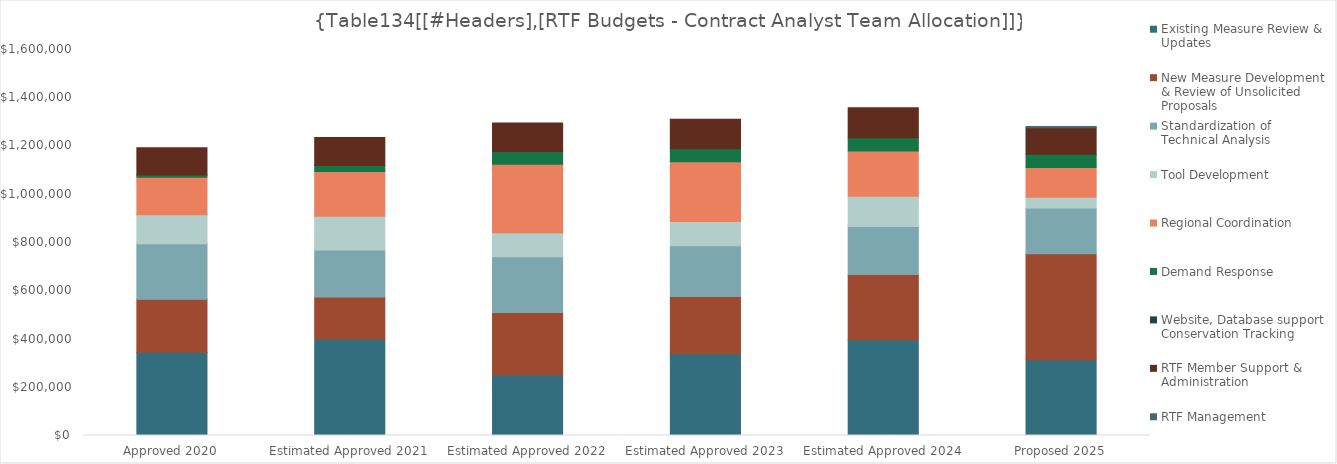
| Category | Existing Measure Review & Updates | New Measure Development & Review of Unsolicited Proposals | Standardization of Technical Analysis | Tool Development | Regional Coordination | Demand Response | Website, Database support, Conservation Tracking  | RTF Member Support & Administration | RTF Management |
|---|---|---|---|---|---|---|---|---|---|
| Approved 2020 | 345000 | 220000 | 230000 | 120000 | 155000 | 10000 | 0 | 113000 | 0 |
| Estimated Approved 2021 | 399800 | 174300 | 194800 | 140400 | 184500 | 25600 | 0 | 115800 | 0 |
| Estimated Approved 2022 | 252200 | 257400 | 231100 | 99800 | 283700 | 52500 | 0 | 118700 | 0 |
| Estimated Approved 2023 | 339200 | 236900 | 210000 | 101200 | 247700 | 53800 | 0 | 121700 | 0 |
| Estimated Approved 2024 | 397400 | 270400 | 198700 | 124700 | 187600 | 55200 | 0 | 124700 | 0 |
| Proposed 2025 | 313500 | 440000 | 189500 | 45000 | 122600 | 55000 | 0 | 110000 | 5000 |